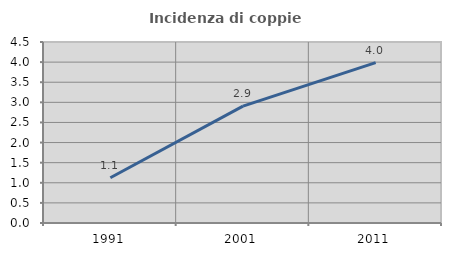
| Category | Incidenza di coppie miste |
|---|---|
| 1991.0 | 1.125 |
| 2001.0 | 2.905 |
| 2011.0 | 3.986 |